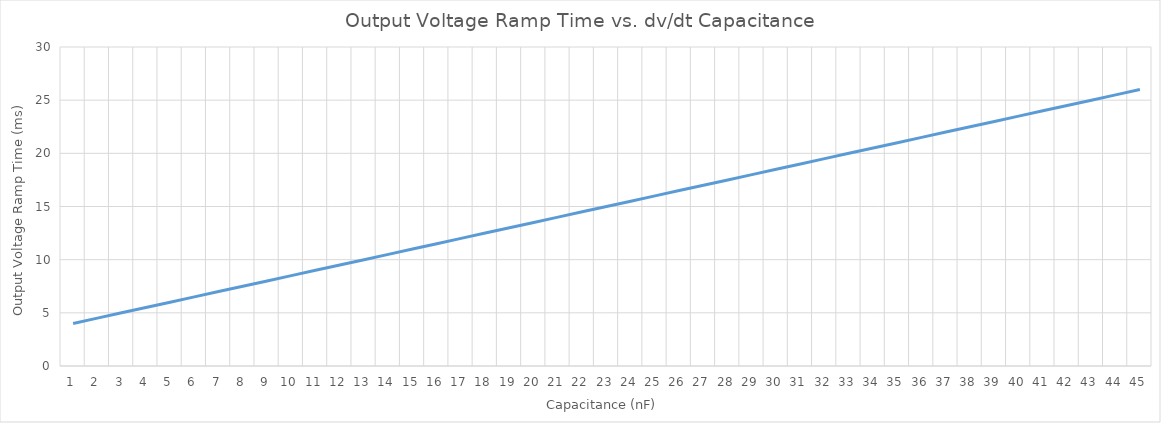
| Category | Series 0 |
|---|---|
| 0 | 4 |
| 1 | 4.5 |
| 2 | 5 |
| 3 | 5.5 |
| 4 | 6 |
| 5 | 6.5 |
| 6 | 7 |
| 7 | 7.5 |
| 8 | 8 |
| 9 | 8.5 |
| 10 | 9 |
| 11 | 9.5 |
| 12 | 10 |
| 13 | 10.5 |
| 14 | 11 |
| 15 | 11.5 |
| 16 | 12 |
| 17 | 12.5 |
| 18 | 13 |
| 19 | 13.5 |
| 20 | 14 |
| 21 | 14.5 |
| 22 | 15 |
| 23 | 15.5 |
| 24 | 16 |
| 25 | 16.5 |
| 26 | 17 |
| 27 | 17.5 |
| 28 | 18 |
| 29 | 18.5 |
| 30 | 19 |
| 31 | 19.5 |
| 32 | 20 |
| 33 | 20.5 |
| 34 | 21 |
| 35 | 21.5 |
| 36 | 22 |
| 37 | 22.5 |
| 38 | 23 |
| 39 | 23.5 |
| 40 | 24 |
| 41 | 24.5 |
| 42 | 25 |
| 43 | 25.5 |
| 44 | 26 |